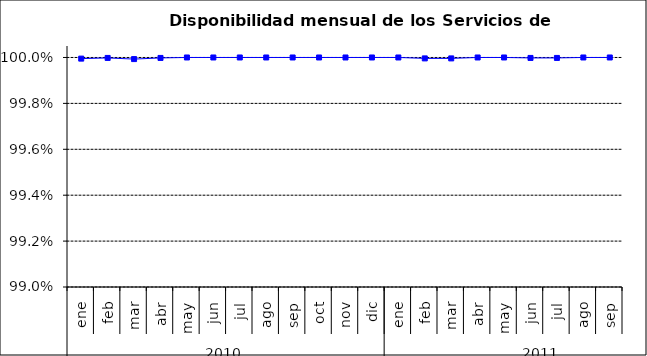
| Category | SCL * |
|---|---|
| 0 | 1 |
| 1 | 1 |
| 2 | 1 |
| 3 | 1 |
| 4 | 1 |
| 5 | 1 |
| 6 | 1 |
| 7 | 1 |
| 8 | 1 |
| 9 | 1 |
| 10 | 1 |
| 11 | 1 |
| 12 | 1 |
| 13 | 1 |
| 14 | 1 |
| 15 | 1 |
| 16 | 1 |
| 17 | 1 |
| 18 | 1 |
| 19 | 1 |
| 20 | 1 |